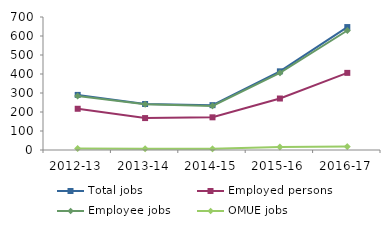
| Category | Total jobs | Employed persons | Employee jobs | OMUE jobs |
|---|---|---|---|---|
| 2012-13 | 290 | 217 | 284 | 8 |
| 2013-14 | 242 | 168 | 241 | 7 |
| 2014-15 | 236 | 172 | 232 | 6 |
| 2015-16 | 414 | 271 | 406 | 16 |
| 2016-17 | 647 | 406 | 629 | 18 |